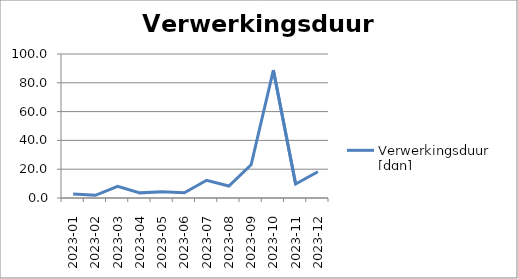
| Category | Verwerkingsduur [dgn] |
|---|---|
| 2023-01 | 2.835 |
| 2023-02 | 1.878 |
| 2023-03 | 8.063 |
| 2023-04 | 3.563 |
| 2023-05 | 4.389 |
| 2023-06 | 3.596 |
| 2023-07 | 12.301 |
| 2023-08 | 8.327 |
| 2023-09 | 23.106 |
| 2023-10 | 88.789 |
| 2023-11 | 9.699 |
| 2023-12 | 18.261 |